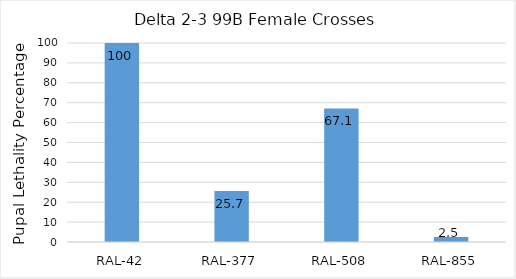
| Category | pupal lethality percentage |
|---|---|
| RAL-42 | 100 |
| RAL-377 | 25.676 |
| RAL-508 | 67.133 |
| RAL-855 | 2.473 |